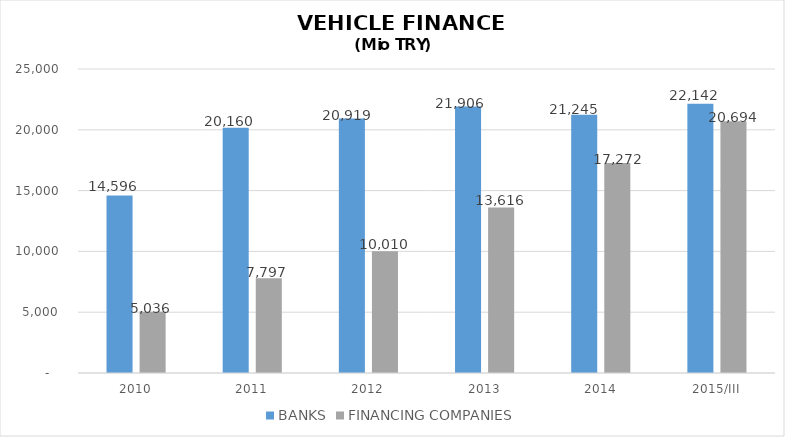
| Category | BANKS | FINANCING COMPANIES |
|---|---|---|
| 2010 | 14596 | 5035.89 |
| 2011 | 20160 | 7796.854 |
| 2012 | 20919 | 10009.755 |
| 2013 | 21906 | 13616.036 |
| 2014 | 21245 | 17271.844 |
| 2015/III | 22142 | 20693.621 |